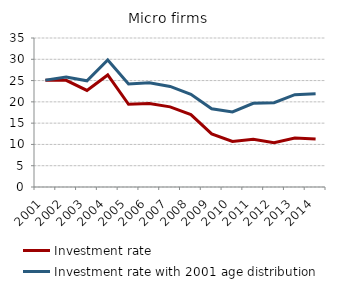
| Category | Investment rate | Investment rate with 2001 age distribution |
|---|---|---|
| 2001.0 | 25.103 | 25.103 |
| 2002.0 | 25.049 | 25.807 |
| 2003.0 | 22.682 | 24.954 |
| 2004.0 | 26.324 | 29.831 |
| 2005.0 | 19.436 | 24.188 |
| 2006.0 | 19.632 | 24.489 |
| 2007.0 | 18.82 | 23.631 |
| 2008.0 | 17 | 21.778 |
| 2009.0 | 12.478 | 18.36 |
| 2010.0 | 10.69 | 17.643 |
| 2011.0 | 11.212 | 19.669 |
| 2012.0 | 10.41 | 19.817 |
| 2013.0 | 11.481 | 21.682 |
| 2014.0 | 11.248 | 21.904 |